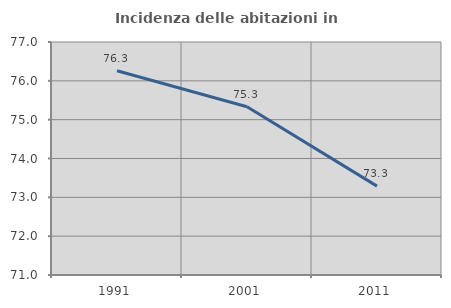
| Category | Incidenza delle abitazioni in proprietà  |
|---|---|
| 1991.0 | 76.258 |
| 2001.0 | 75.332 |
| 2011.0 | 73.288 |